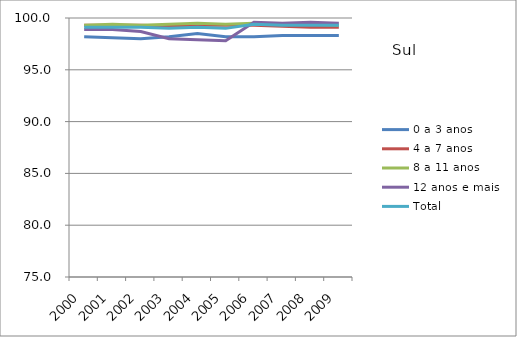
| Category | 0 a 3 anos | 4 a 7 anos | 8 a 11 anos | 12 anos e mais | Total |
|---|---|---|---|---|---|
| 2000.0 | 98.2 | 99.3 | 99.3 | 98.9 | 99.1 |
| 2001.0 | 98.1 | 99.3 | 99.4 | 98.9 | 99.1 |
| 2002.0 | 98 | 99.3 | 99.3 | 98.7 | 99.1 |
| 2003.0 | 98.2 | 99.2 | 99.4 | 98 | 99 |
| 2004.0 | 98.5 | 99.3 | 99.5 | 97.9 | 99.1 |
| 2005.0 | 98.2 | 99.3 | 99.4 | 97.8 | 99 |
| 2006.0 | 98.2 | 99.3 | 99.5 | 99.6 | 99.4 |
| 2007.0 | 98.3 | 99.2 | 99.4 | 99.5 | 99.3 |
| 2008.0 | 98.3 | 99.1 | 99.4 | 99.6 | 99.3 |
| 2009.0 | 98.3 | 99.1 | 99.3 | 99.5 | 99.3 |